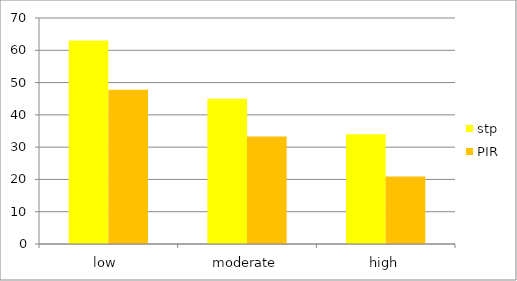
| Category | stp | PIR |
|---|---|---|
| low  | 63 | 47.8 |
| moderate | 45 | 33.3 |
| high | 34 | 20.9 |